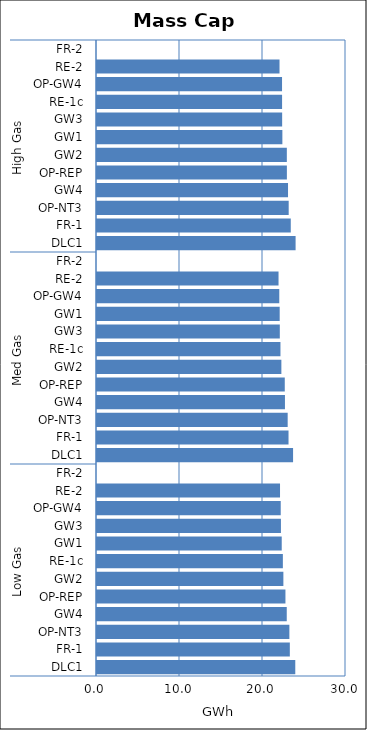
| Category | Mass Cap A |
|---|---|
| 0 | 23.889 |
| 1 | 23.232 |
| 2 | 23.179 |
| 3 | 22.862 |
| 4 | 22.704 |
| 5 | 22.455 |
| 6 | 22.394 |
| 7 | 22.257 |
| 8 | 22.162 |
| 9 | 22.136 |
| 10 | 22.051 |
| 11 | 0 |
| 12 | 23.623 |
| 13 | 23.076 |
| 14 | 22.973 |
| 15 | 22.645 |
| 16 | 22.623 |
| 17 | 22.213 |
| 18 | 22.104 |
| 19 | 22.025 |
| 20 | 22.011 |
| 21 | 21.961 |
| 22 | 21.872 |
| 23 | 0 |
| 24 | 23.927 |
| 25 | 23.346 |
| 26 | 23.095 |
| 27 | 23.014 |
| 28 | 22.878 |
| 29 | 22.872 |
| 30 | 22.334 |
| 31 | 22.307 |
| 32 | 22.299 |
| 33 | 22.294 |
| 34 | 21.99 |
| 35 | 0 |